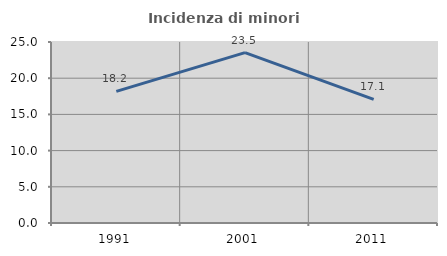
| Category | Incidenza di minori stranieri |
|---|---|
| 1991.0 | 18.182 |
| 2001.0 | 23.529 |
| 2011.0 | 17.073 |